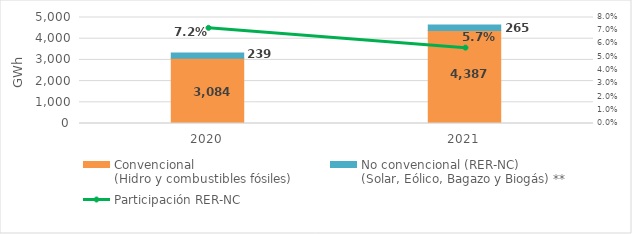
| Category | Convencional
(Hidro y combustibles fósiles) | No convencional (RER-NC)
(Solar, Eólico, Bagazo y Biogás) ** |
|---|---|---|
| 2020.0 | 3083.707 | 238.62 |
| 2021.0 | 4387.483 | 264.579 |